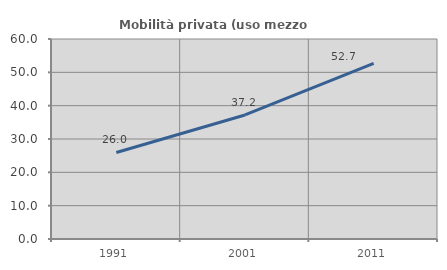
| Category | Mobilità privata (uso mezzo privato) |
|---|---|
| 1991.0 | 25.969 |
| 2001.0 | 37.208 |
| 2011.0 | 52.693 |